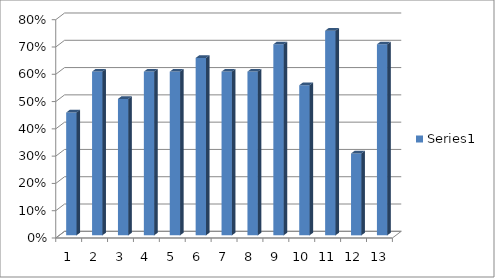
| Category | Series 0 |
|---|---|
| 1.0 | 0.45 |
| 2.0 | 0.6 |
| 3.0 | 0.5 |
| 4.0 | 0.6 |
| 5.0 | 0.6 |
| 6.0 | 0.65 |
| 7.0 | 0.6 |
| 8.0 | 0.6 |
| 9.0 | 0.7 |
| 10.0 | 0.55 |
| 11.0 | 0.75 |
| 12.0 | 0.3 |
| 13.0 | 0.7 |